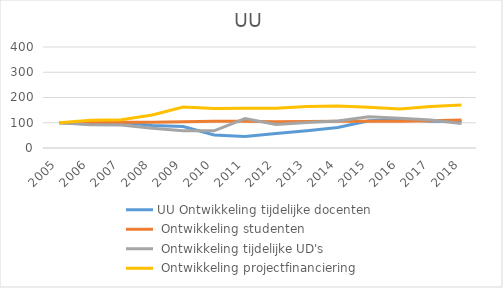
| Category | UU Ontwikkeling tijdelijke docenten | UU Ontwikkeling studenten | UU Ontwikkeling tijdelijke UD's | UU Ontwikkeling projectfinanciering |
|---|---|---|---|---|
| 2005.0 | 100 | 100 | 100 | 100 |
| 2006.0 | 94.92 | 101.96 | 91.667 | 110.006 |
| 2007.0 | 101.604 | 101.591 | 91.146 | 111.742 |
| 2008.0 | 89.305 | 101.925 | 78.646 | 130.669 |
| 2009.0 | 84.759 | 104.136 | 68.75 | 162.641 |
| 2010.0 | 51.604 | 105.72 | 68.229 | 156.179 |
| 2011.0 | 45.187 | 106.089 | 116.667 | 157.088 |
| 2012.0 | 57.487 | 103.614 | 92.708 | 157.868 |
| 2013.0 | 68.717 | 104.944 | 101.042 | 164.535 |
| 2014.0 | 81.016 | 105.738 | 106.771 | 166.465 |
| 2015.0 | 107.487 | 105.678 | 123.958 | 161.775 |
| 2016.0 | 113.904 | 106.267 | 117.708 | 154.145 |
| 2017.0 | 105.647 | 107.732 | 111.068 | 163.959 |
| 2018.0 | 105.377 | 110.716 | 96.823 | 170.034 |